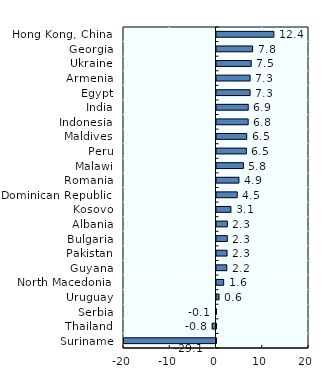
| Category | Real IRRs |
|---|---|
| Hong Kong, China | 12.406 |
| Georgia | 7.81 |
| Ukraine | 7.506 |
| Armenia | 7.264 |
| Egypt | 7.263 |
| India | 6.868 |
| Indonesia | 6.845 |
| Maldives | 6.531 |
| Peru | 6.458 |
| Malawi | 5.821 |
| Romania | 4.856 |
| Dominican Republic | 4.478 |
| Kosovo | 3.12 |
| Albania | 2.347 |
| Bulgaria | 2.338 |
| Pakistan | 2.282 |
| Guyana | 2.224 |
| North Macedonia | 1.554 |
| Uruguay | 0.552 |
| Serbia | -0.11 |
| Thailand | -0.818 |
| Suriname | -29.051 |